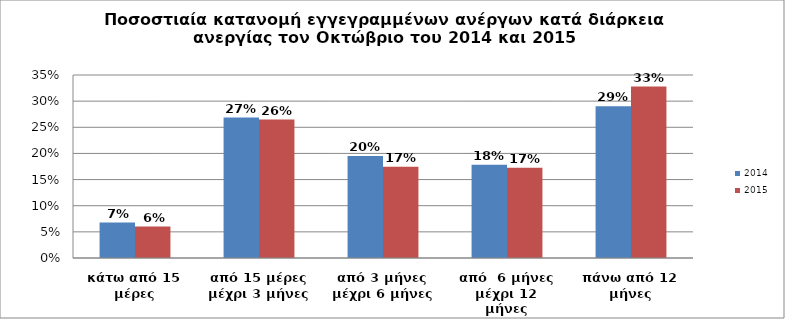
| Category | 2014 | 2015 |
|---|---|---|
| κάτω από 15 μέρες | 0.068 | 0.06 |
| από 15 μέρες μέχρι 3 μήνες | 0.269 | 0.265 |
| από 3 μήνες μέχρι 6 μήνες | 0.195 | 0.175 |
| από  6 μήνες μέχρι 12 μήνες | 0.178 | 0.173 |
| πάνω από 12 μήνες | 0.29 | 0.328 |